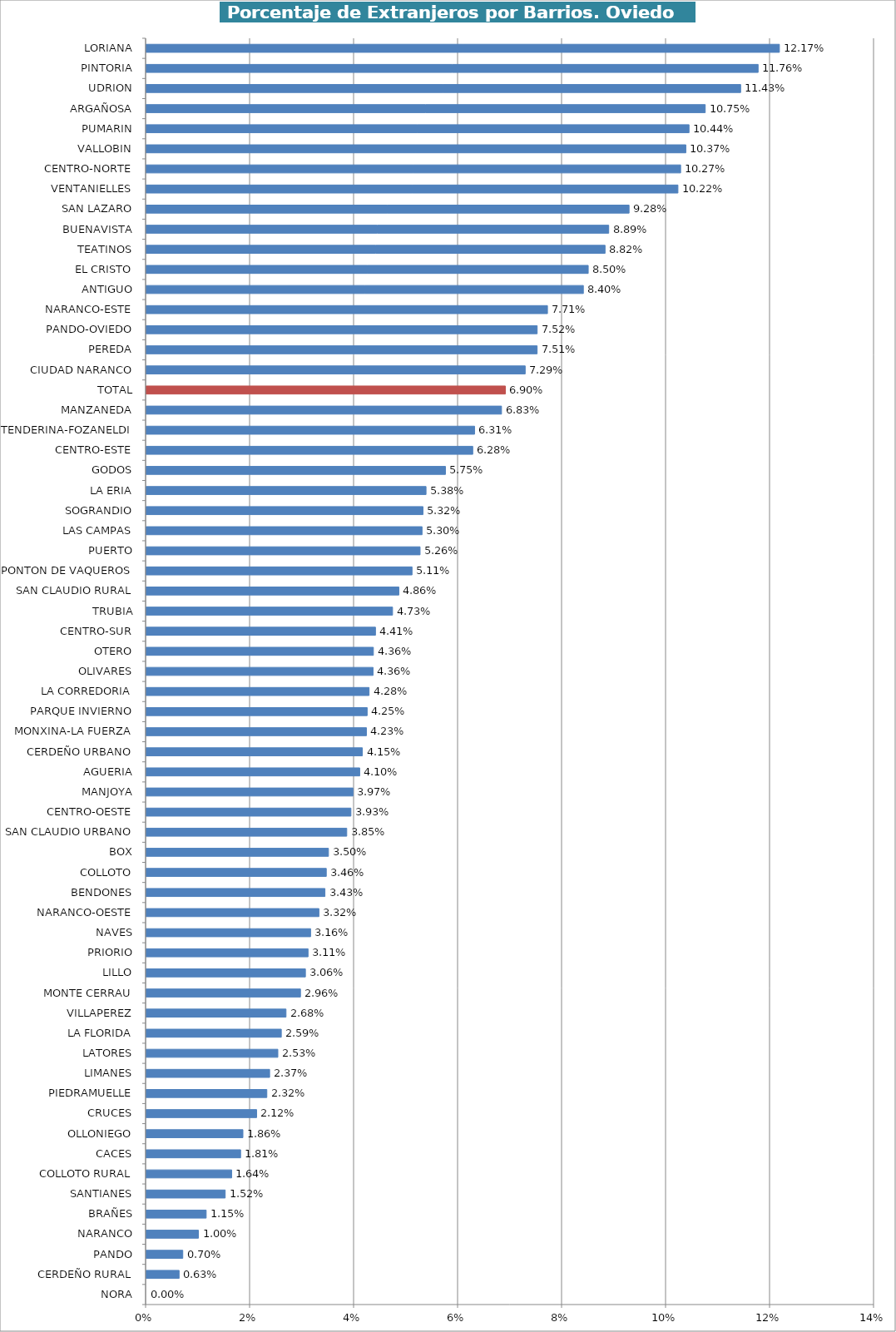
| Category | Series 0 |
|---|---|
| NORA | 0 |
| CERDEÑO RURAL | 0.006 |
| PANDO | 0.007 |
| NARANCO | 0.01 |
| BRAÑES | 0.011 |
| SANTIANES | 0.015 |
| COLLOTO RURAL | 0.016 |
| CACES | 0.018 |
| OLLONIEGO | 0.019 |
| CRUCES | 0.021 |
| PIEDRAMUELLE | 0.023 |
| LIMANES | 0.024 |
| LATORES | 0.025 |
| LA FLORIDA | 0.026 |
| VILLAPEREZ | 0.027 |
| MONTE CERRAU | 0.03 |
| LILLO | 0.031 |
| PRIORIO | 0.031 |
| NAVES | 0.032 |
| NARANCO-OESTE | 0.033 |
| BENDONES | 0.034 |
| COLLOTO | 0.035 |
| BOX | 0.035 |
| SAN CLAUDIO URBANO | 0.039 |
| CENTRO-OESTE | 0.039 |
| MANJOYA | 0.04 |
| AGUERIA | 0.041 |
| CERDEÑO URBANO | 0.042 |
| MONXINA-LA FUERZA | 0.042 |
| PARQUE INVIERNO | 0.042 |
| LA CORREDORIA | 0.043 |
| OLIVARES | 0.044 |
| OTERO | 0.044 |
| CENTRO-SUR | 0.044 |
| TRUBIA | 0.047 |
| SAN CLAUDIO RURAL | 0.049 |
| PONTON DE VAQUEROS | 0.051 |
| PUERTO | 0.053 |
| LAS CAMPAS | 0.053 |
| SOGRANDIO | 0.053 |
| LA ERIA | 0.054 |
| GODOS | 0.058 |
| CENTRO-ESTE | 0.063 |
| TENDERINA-FOZANELDI | 0.063 |
| MANZANEDA | 0.068 |
| TOTAL | 0.069 |
| CIUDAD NARANCO | 0.073 |
| PEREDA | 0.075 |
| PANDO-OVIEDO | 0.075 |
| NARANCO-ESTE | 0.077 |
| ANTIGUO | 0.084 |
| EL CRISTO | 0.085 |
| TEATINOS | 0.088 |
| BUENAVISTA | 0.089 |
| SAN LAZARO | 0.093 |
| VENTANIELLES | 0.102 |
| CENTRO-NORTE | 0.103 |
| VALLOBIN | 0.104 |
| PUMARIN | 0.104 |
| ARGAÑOSA | 0.107 |
| UDRION | 0.114 |
| PINTORIA | 0.118 |
| LORIANA | 0.122 |